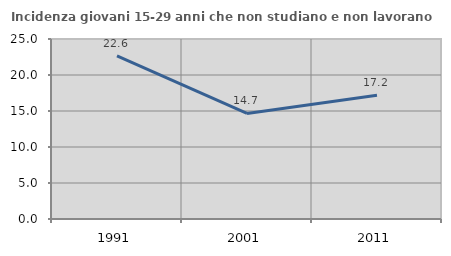
| Category | Incidenza giovani 15-29 anni che non studiano e non lavorano  |
|---|---|
| 1991.0 | 22.642 |
| 2001.0 | 14.667 |
| 2011.0 | 17.188 |